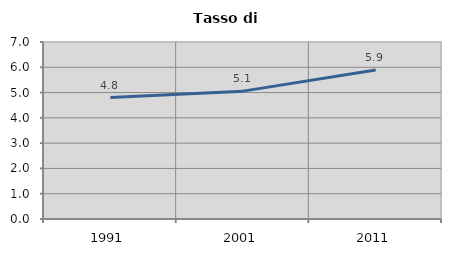
| Category | Tasso di disoccupazione   |
|---|---|
| 1991.0 | 4.804 |
| 2001.0 | 5.057 |
| 2011.0 | 5.891 |